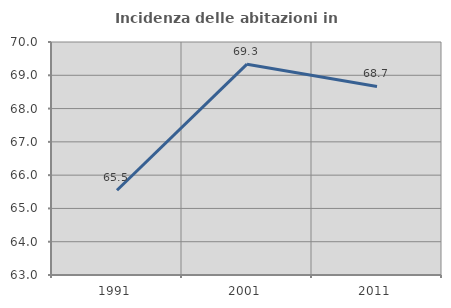
| Category | Incidenza delle abitazioni in proprietà  |
|---|---|
| 1991.0 | 65.546 |
| 2001.0 | 69.333 |
| 2011.0 | 68.664 |